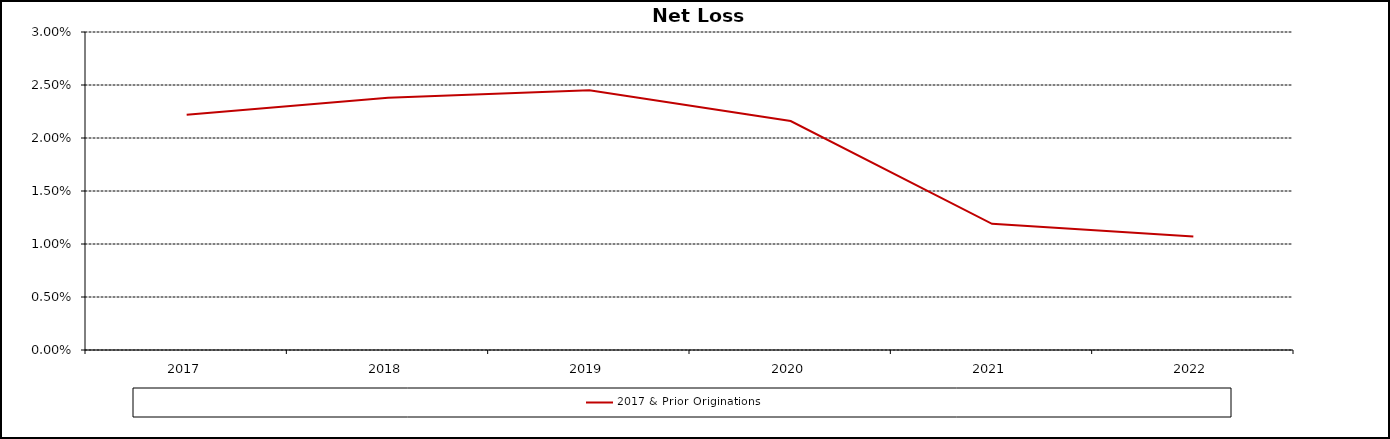
| Category | 2017 & Prior Originations |
|---|---|
| 2017.0 | 0.022 |
| 2018.0 | 0.024 |
| 2019.0 | 0.024 |
| 2020.0 | 0.022 |
| 2021.0 | 0.012 |
| 44926.0 | 0.011 |